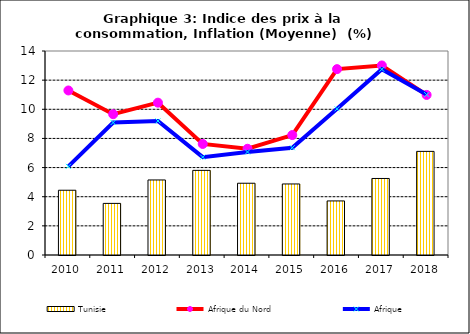
| Category | Tunisie |
|---|---|
| 2010.0 | 4.444 |
| 2011.0 | 3.542 |
| 2012.0 | 5.15 |
| 2013.0 | 5.808 |
| 2014.0 | 4.925 |
| 2015.0 | 4.875 |
| 2016.0 | 3.711 |
| 2017.0 | 5.252 |
| 2018.0 | 7.111 |